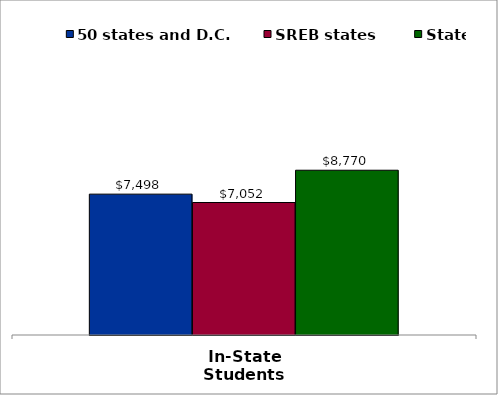
| Category | 50 states and D.C. | SREB states | State |
|---|---|---|---|
| In-State Students | 7498 | 7052.25 | 8770 |